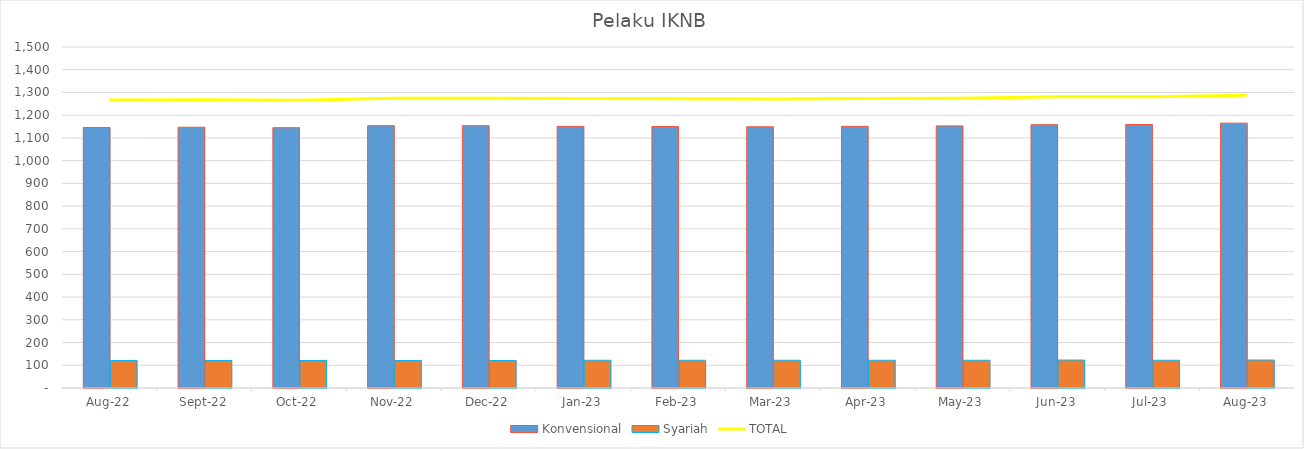
| Category |  Konvensional  |  Syariah  |
|---|---|---|
| 2022-08-01 | 1146 | 121 |
| 2022-09-01 | 1147 | 121 |
| 2022-10-01 | 1145 | 121 |
| 2022-11-01 | 1154 | 121 |
| 2022-12-01 | 1154 | 121 |
| 2023-01-01 | 1151 | 122 |
| 2023-02-01 | 1150 | 122 |
| 2023-03-01 | 1149 | 122 |
| 2023-04-01 | 1151 | 122 |
| 2023-05-01 | 1153 | 122 |
| 2023-06-01 | 1158 | 123 |
| 2023-07-01 | 1159 | 122 |
| 2023-08-01 | 1165 | 123 |